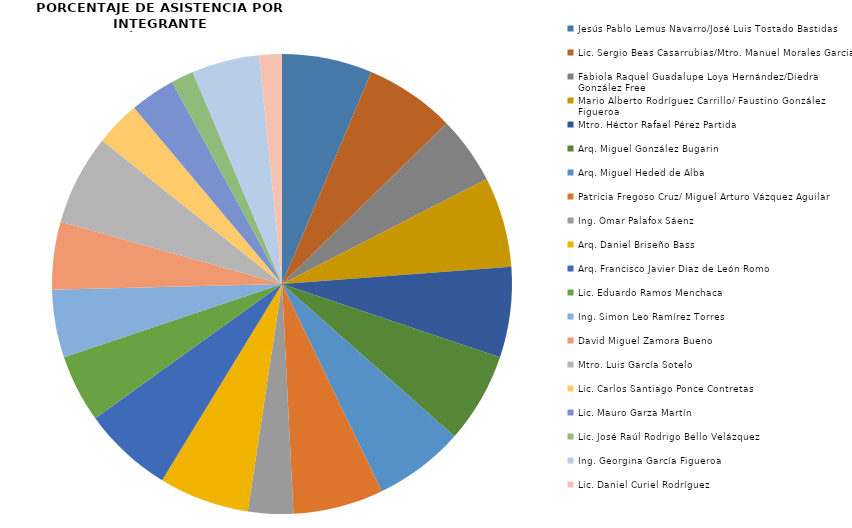
| Category | Series 0 |
|---|---|
| Jesús Pablo Lemus Navarro/José Luis Tostado Bastidas | 4 |
| Lic. Sergio Beas Casarrubias/Mtro. Manuel Morales Garcia | 4 |
| Fabiola Raquel Guadalupe Loya Hernández/Diedra González Free | 3 |
| Mario Alberto Rodríguez Carrillo/ Faustino González Figueroa | 4 |
| Mtro. Héctor Rafael Pérez Partida | 4 |
| Arq. Miguel González Bugarin | 4 |
| Arq. Miguel Heded de Alba | 4 |
| Patricia Fregoso Cruz/ Miguel Arturo Vázquez Aguilar | 4 |
| Ing. Omar Palafox Sáenz | 2 |
| Arq. Daniel Briseño Bass | 4 |
| Arq. Francisco Javier Diaz de León Romo | 4 |
| Lic. Eduardo Ramos Menchaca | 3 |
| Ing. Simon Leo Ramírez Torres | 3 |
| David Miguel Zamora Bueno | 3 |
| Mtro. Luis García Sotelo | 4 |
| Lic. Carlos Santiago Ponce Contretas | 2 |
| Lic. Mauro Garza Martín | 2 |
| Lic. José Raúl Rodrigo Bello Velázquez | 1 |
| Ing. Georgina García Figueroa | 3 |
| Lic. Daniel Curiel Rodríguez | 1 |